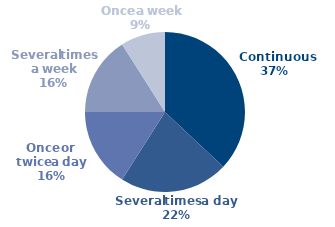
| Category | Series 0 |
|---|---|
| Continuous | 37 |
| Several times a day | 22 |
| Once or twice a day | 16 |
| Several times a week | 16 |
| Once a week | 9 |